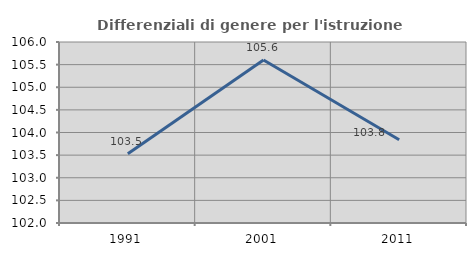
| Category | Differenziali di genere per l'istruzione superiore |
|---|---|
| 1991.0 | 103.532 |
| 2001.0 | 105.602 |
| 2011.0 | 103.839 |